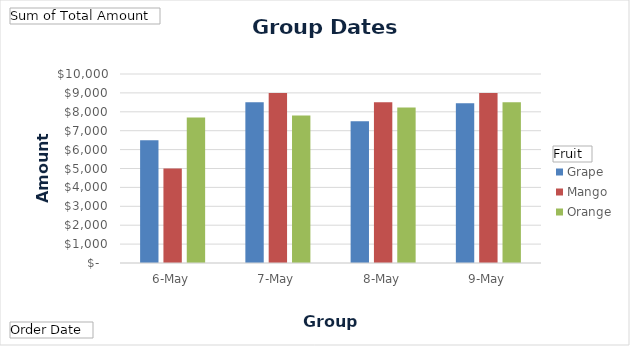
| Category | Grape | Mango | Orange |
|---|---|---|---|
| 6-May | 6500 | 5000 | 7700 |
| 7-May | 8500 | 9000 | 7800 |
| 8-May | 7500 | 8500 | 8230 |
| 9-May | 8450 | 9000 | 8500 |